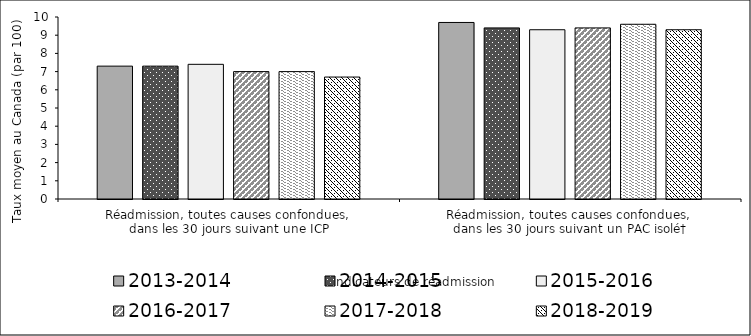
| Category | 2013-2014 | 2014-2015 | 2015-2016 | 2016-2017 | 2017-2018 | 2018-2019 |
|---|---|---|---|---|---|---|
| Réadmission, toutes causes confondues, 
dans les 30 jours suivant une ICP | 7.3 | 7.3 | 7.4 | 7 | 7 | 6.7 |
| Réadmission, toutes causes confondues, 
dans les 30 jours suivant un PAC isolé† | 9.7 | 9.4 | 9.3 | 9.4 | 9.6 | 9.3 |